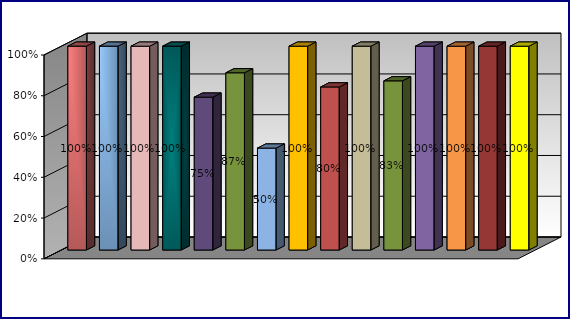
| Category | Series 0 | Series 1 |
|---|---|---|
| 0 | 1 |  |
| 1 | 1 |  |
| 2 | 1 |  |
| 3 | 1 |  |
| 4 | 0.75 |  |
| 5 | 0.87 |  |
| 6 | 0.5 |  |
| 7 | 1 |  |
| 8 | 0.8 |  |
| 9 | 1 |  |
| 10 | 0.83 |  |
| 11 | 1 |  |
| 12 | 1 |  |
| 13 | 1 |  |
| 14 | 1 |  |